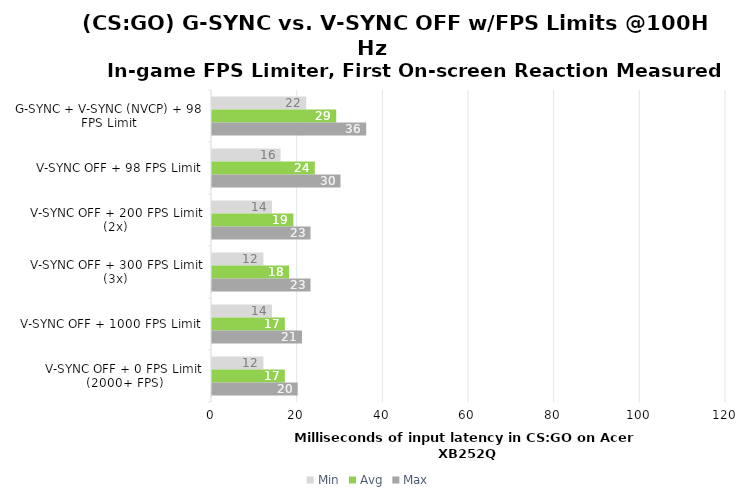
| Category | Min | Avg | Max |
|---|---|---|---|
| G-SYNC + V-SYNC (NVCP) + 98 FPS Limit | 22 | 29 | 36 |
| V-SYNC OFF + 98 FPS Limit | 16 | 24 | 30 |
| V-SYNC OFF + 200 FPS Limit (2x) | 14 | 19 | 23 |
| V-SYNC OFF + 300 FPS Limit (3x) | 12 | 18 | 23 |
| V-SYNC OFF + 1000 FPS Limit | 14 | 17 | 21 |
| V-SYNC OFF + 0 FPS Limit (2000+ FPS) | 12 | 17 | 20 |